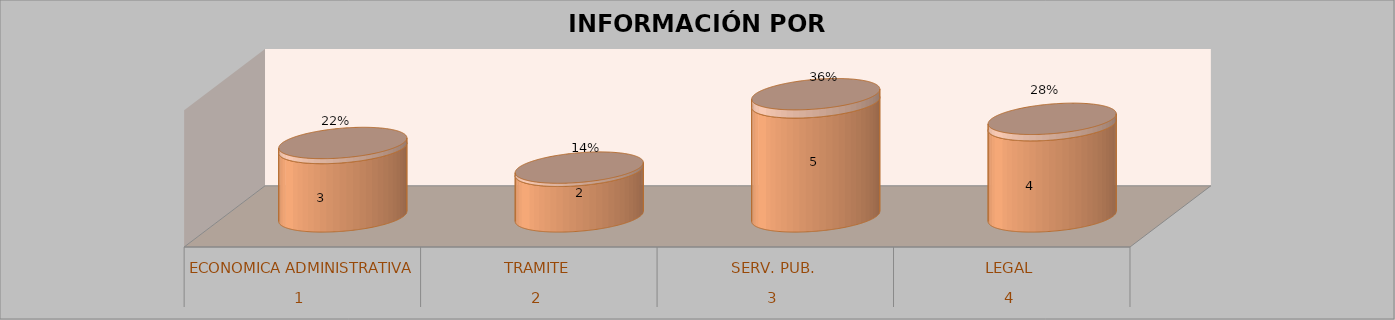
| Category | Series 0 | Series 1 | Series 2 | Series 3 |
|---|---|---|---|---|
| 0 |  |  | 3 | 0.22 |
| 1 |  |  | 2 | 0.14 |
| 2 |  |  | 5 | 0.36 |
| 3 |  |  | 4 | 0.28 |